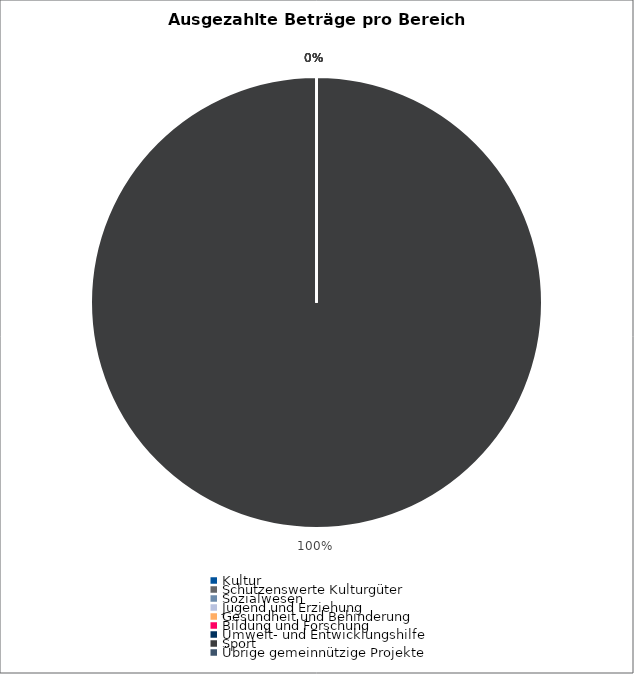
| Category | Series 0 |
|---|---|
| Kultur | 0 |
| Schützenswerte Kulturgüter | 0 |
| Sozialwesen | 0 |
| Jugend und Erziehung | 0 |
| Gesundheit und Behinderung | 0 |
| Bildung und Forschung | 0 |
| Umwelt- und Entwicklungshilfe | 0 |
| Sport | 674338 |
| Übrige gemeinnützige Projekte | 0 |